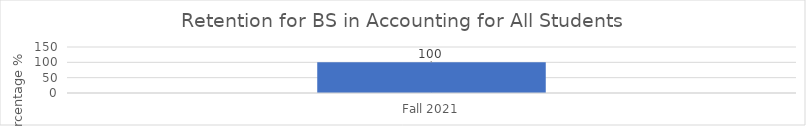
| Category | Percentage of Retention Students |
|---|---|
| Fall 2021 | 100 |